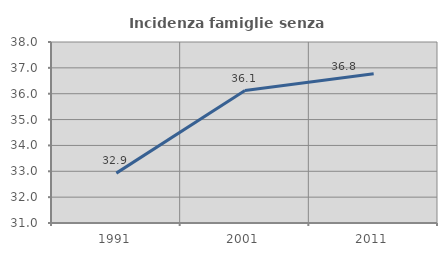
| Category | Incidenza famiglie senza nuclei |
|---|---|
| 1991.0 | 32.929 |
| 2001.0 | 36.124 |
| 2011.0 | 36.771 |